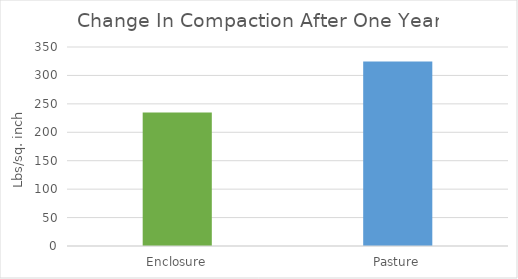
| Category | Series 0 |
|---|---|
| Enclosure | 235 |
| Pasture | 324.306 |